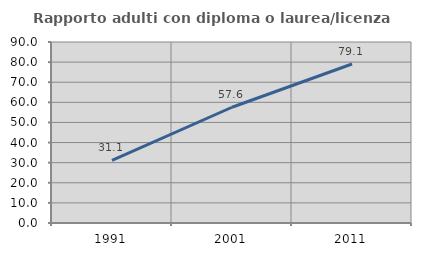
| Category | Rapporto adulti con diploma o laurea/licenza media  |
|---|---|
| 1991.0 | 31.092 |
| 2001.0 | 57.554 |
| 2011.0 | 79.07 |